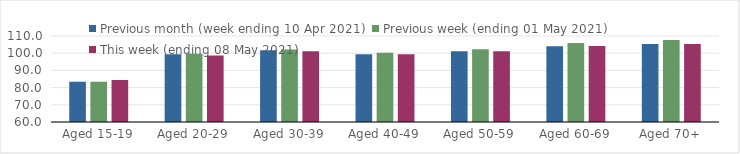
| Category | Previous month (week ending 10 Apr 2021) | Previous week (ending 01 May 2021) | This week (ending 08 May 2021) |
|---|---|---|---|
| Aged 15-19 | 83.42 | 83.43 | 84.41 |
| Aged 20-29 | 99.44 | 99.63 | 98.7 |
| Aged 30-39 | 101.7 | 102.1 | 101.11 |
| Aged 40-49 | 99.4 | 100.25 | 99.36 |
| Aged 50-59 | 101.16 | 102.32 | 101.15 |
| Aged 60-69 | 103.99 | 105.88 | 104.16 |
| Aged 70+ | 105.32 | 107.62 | 105.38 |